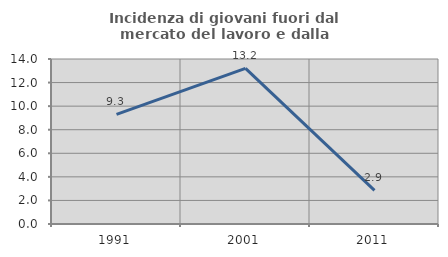
| Category | Incidenza di giovani fuori dal mercato del lavoro e dalla formazione  |
|---|---|
| 1991.0 | 9.302 |
| 2001.0 | 13.208 |
| 2011.0 | 2.857 |